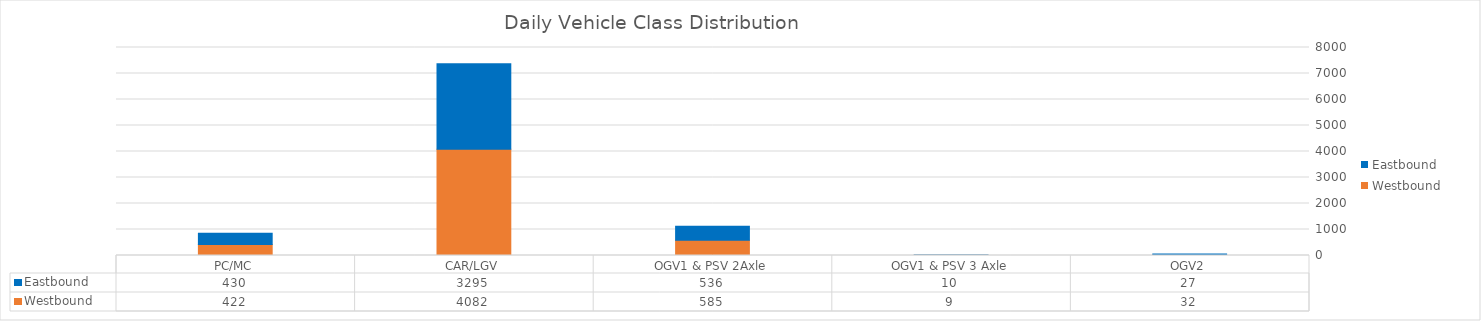
| Category | Westbound | Eastbound |
|---|---|---|
| PC/MC | 422.286 | 429.571 |
| CAR/LGV | 4082.429 | 3294.714 |
| OGV1 & PSV 2Axle | 585.286 | 536.429 |
| OGV1 & PSV 3 Axle | 8.857 | 9.714 |
| OGV2 | 32 | 26.714 |